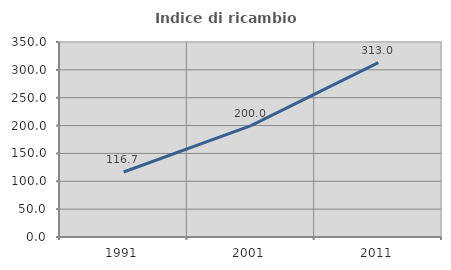
| Category | Indice di ricambio occupazionale  |
|---|---|
| 1991.0 | 116.667 |
| 2001.0 | 200 |
| 2011.0 | 313.043 |